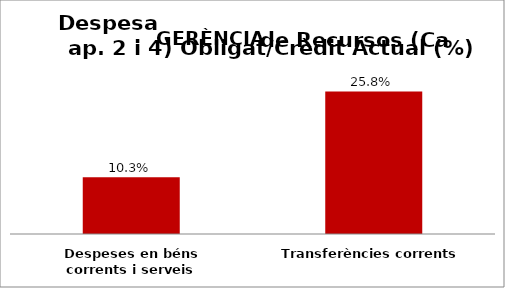
| Category | Series 0 |
|---|---|
| Despeses en béns corrents i serveis | 0.103 |
| Transferències corrents | 0.258 |